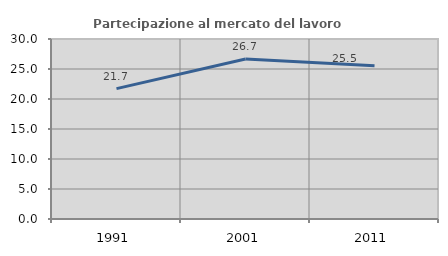
| Category | Partecipazione al mercato del lavoro  femminile |
|---|---|
| 1991.0 | 21.735 |
| 2001.0 | 26.655 |
| 2011.0 | 25.523 |